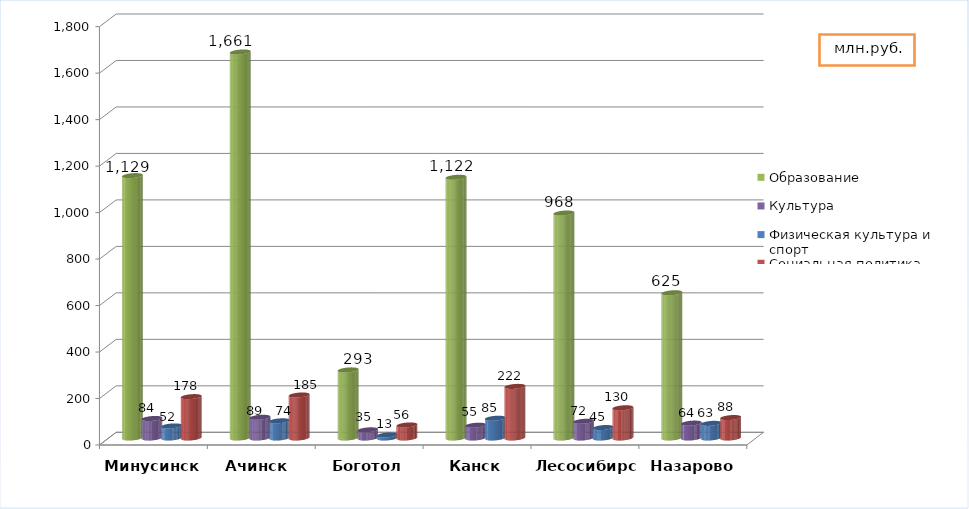
| Category | Образование | Культура | Физическая культура и спорт | Социальная политика |
|---|---|---|---|---|
| Минусинск | 1129 | 84 | 52 | 178 |
| Ачинск  | 1661 | 89 | 74 | 185 |
| Боготол | 293 | 35 | 13 | 56 |
| Канск | 1122 | 55 | 85 | 222 |
| Лесосибирск | 968 | 72 | 45 | 130 |
| Назарово | 625 | 64 | 63 | 88 |